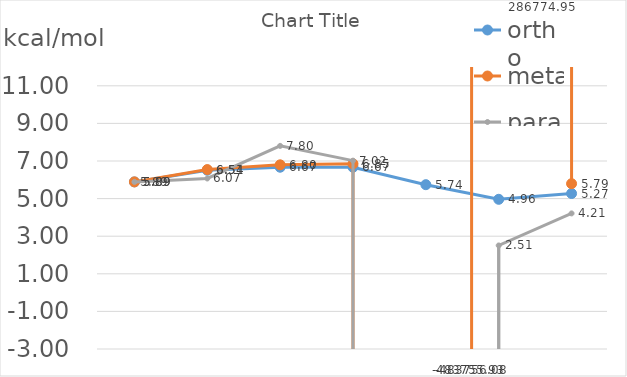
| Category | ortho | meta | para |
|---|---|---|---|
| 0 | 5.888 | 5.888 | 5.888 |
| 1 | 6.509 | 6.544 | 6.07 |
| 2 | 6.67 | 6.796 | 7.804 |
| 3 | 6.669 | 6.851 | 7.019 |
| 4 | 5.74 | -483756.075 | -483755.928 |
| 5 | 4.962 | 286774.946 | 2.508 |
| 6 | 5.271 | 5.794 | 4.213 |